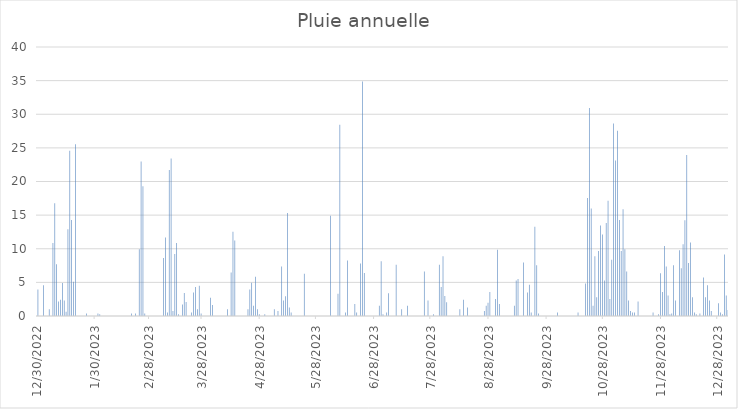
| Category | Pluie |
|---|---|
| 12/30/22 | 3.94 |
| 12/31/22 | 0 |
| 1/1/23 | 0 |
| 1/2/23 | 4.57 |
| 1/3/23 | 0 |
| 1/4/23 | 0 |
| 1/5/23 | 1.02 |
| 1/6/23 | 0 |
| 1/7/23 | 10.86 |
| 1/8/23 | 16.76 |
| 1/9/23 | 7.68 |
| 1/10/23 | 2.16 |
| 1/11/23 | 2.41 |
| 1/12/23 | 4.89 |
| 1/13/23 | 2.29 |
| 1/14/23 | 0.64 |
| 1/15/23 | 12.89 |
| 1/16/23 | 24.57 |
| 1/17/23 | 14.29 |
| 1/18/23 | 5.08 |
| 1/19/23 | 25.53 |
| 1/20/23 | 0 |
| 1/21/23 | 0 |
| 1/22/23 | 0 |
| 1/23/23 | 0 |
| 1/24/23 | 0 |
| 1/25/23 | 0.38 |
| 1/26/23 | 0 |
| 1/27/23 | 0 |
| 1/28/23 | 0 |
| 1/29/23 | 0 |
| 1/30/23 | 0 |
| 1/31/23 | 0.38 |
| 2/1/23 | 0.25 |
| 2/2/23 | 0 |
| 2/3/23 | 0 |
| 2/4/23 | 0 |
| 2/5/23 | 0 |
| 2/6/23 | 0 |
| 2/7/23 | 0 |
| 2/8/23 | 0 |
| 2/9/23 | 0 |
| 2/10/23 | 0 |
| 2/11/23 | 0 |
| 2/12/23 | 0 |
| 2/13/23 | 0 |
| 2/14/23 | 0 |
| 2/15/23 | 0 |
| 2/16/23 | 0 |
| 2/17/23 | 0 |
| 2/18/23 | 0.38 |
| 2/19/23 | 0 |
| 2/20/23 | 0.38 |
| 2/21/23 | 0 |
| 2/22/23 | 9.91 |
| 2/23/23 | 22.99 |
| 2/24/23 | 19.3 |
| 2/25/23 | 0.38 |
| 2/26/23 | 0 |
| 2/27/23 | 0 |
| 2/28/23 | 0 |
| 3/1/23 | 0 |
| 3/2/23 | 0 |
| 3/3/23 | 0 |
| 3/4/23 | 0 |
| 3/5/23 | 0 |
| 3/6/23 | 0 |
| 3/7/23 | 8.64 |
| 3/8/23 | 11.68 |
| 3/9/23 | 0.51 |
| 3/10/23 | 21.72 |
| 3/11/23 | 23.43 |
| 3/12/23 | 0.76 |
| 3/13/23 | 9.21 |
| 3/14/23 | 10.86 |
| 3/15/23 | 0.25 |
| 3/16/23 | 0 |
| 3/17/23 | 1.71 |
| 3/18/23 | 3.43 |
| 3/19/23 | 2.1 |
| 3/20/23 | 0 |
| 3/21/23 | 0 |
| 3/22/23 | 0.51 |
| 3/23/23 | 3.49 |
| 3/24/23 | 4.32 |
| 3/25/23 | 1.02 |
| 3/26/23 | 4.51 |
| 3/27/23 | 0.38 |
| 3/28/23 | 0 |
| 3/29/23 | 0 |
| 3/30/23 | 0 |
| 3/31/23 | 0 |
| 4/1/23 | 2.73 |
| 4/2/23 | 1.65 |
| 4/3/23 | 0 |
| 4/4/23 | 0 |
| 4/5/23 | 0 |
| 4/6/23 | 0 |
| 4/7/23 | 0 |
| 4/8/23 | 0 |
| 4/9/23 | 0 |
| 4/10/23 | 1.02 |
| 4/11/23 | 0 |
| 4/12/23 | 6.48 |
| 4/13/23 | 12.51 |
| 4/14/23 | 11.24 |
| 4/15/23 | 0 |
| 4/16/23 | 0 |
| 4/17/23 | 0 |
| 4/18/23 | 0 |
| 4/19/23 | 0 |
| 4/20/23 | 0 |
| 4/21/23 | 1.02 |
| 4/22/23 | 3.94 |
| 4/23/23 | 4.95 |
| 4/24/23 | 1.52 |
| 4/25/23 | 5.84 |
| 4/26/23 | 1.02 |
| 4/27/23 | 0.25 |
| 4/28/23 | 0 |
| 4/29/23 | 0 |
| 4/30/23 | 0.25 |
| 5/1/23 | 0 |
| 5/2/23 | 0 |
| 5/3/23 | 0 |
| 5/4/23 | 0 |
| 5/5/23 | 1.02 |
| 5/6/23 | 0 |
| 5/7/23 | 0.76 |
| 5/8/23 | 0 |
| 5/9/23 | 7.37 |
| 5/10/23 | 2.29 |
| 5/11/23 | 2.92 |
| 5/12/23 | 15.3 |
| 5/13/23 | 1.27 |
| 5/14/23 | 0.51 |
| 5/15/23 | 0 |
| 5/16/23 | 0 |
| 5/17/23 | 0 |
| 5/18/23 | 0 |
| 5/19/23 | 0 |
| 5/20/23 | 0 |
| 5/21/23 | 6.29 |
| 5/22/23 | 0 |
| 5/23/23 | 0 |
| 5/24/23 | 0 |
| 5/25/23 | 0 |
| 5/26/23 | 0 |
| 5/27/23 | 0 |
| 5/28/23 | 0 |
| 5/29/23 | 0 |
| 5/30/23 | 0 |
| 5/31/23 | 0 |
| 6/1/23 | 0 |
| 6/2/23 | 0 |
| 6/3/23 | 0 |
| 6/4/23 | 14.92 |
| 6/5/23 | 0 |
| 6/6/23 | 0 |
| 6/7/23 | 0 |
| 6/8/23 | 3.3 |
| 6/9/23 | 28.45 |
| 6/10/23 | 0 |
| 6/11/23 | 0 |
| 6/12/23 | 0.51 |
| 6/13/23 | 8.26 |
| 6/14/23 | 0 |
| 6/15/23 | 0 |
| 6/16/23 | 0 |
| 6/17/23 | 1.78 |
| 6/18/23 | 0.51 |
| 6/19/23 | 0 |
| 6/20/23 | 7.81 |
| 6/21/23 | 34.86 |
| 6/22/23 | 6.41 |
| 6/23/23 | 0 |
| 6/24/23 | 0 |
| 6/25/23 | 0 |
| 6/26/23 | 0 |
| 6/27/23 | 0 |
| 6/28/23 | 0 |
| 6/29/23 | 0 |
| 6/30/23 | 1.52 |
| 7/1/23 | 8.13 |
| 7/2/23 | 0.25 |
| 7/3/23 | 0 |
| 7/4/23 | 0.51 |
| 7/5/23 | 3.37 |
| 7/6/23 | 0 |
| 7/7/23 | 0 |
| 7/8/23 | 0 |
| 7/9/23 | 7.62 |
| 7/10/23 | 0 |
| 7/11/23 | 0 |
| 7/12/23 | 1.02 |
| 7/13/23 | 0 |
| 7/14/23 | 0 |
| 7/15/23 | 1.52 |
| 7/16/23 | 0 |
| 7/17/23 | 0 |
| 7/18/23 | 0 |
| 7/19/23 | 0 |
| 7/20/23 | 0 |
| 7/21/23 | 0 |
| 7/22/23 | 0 |
| 7/23/23 | 0 |
| 7/24/23 | 6.6 |
| 7/25/23 | 0 |
| 7/26/23 | 2.29 |
| 7/27/23 | 0 |
| 7/28/23 | 0 |
| 7/29/23 | 0.25 |
| 7/30/23 | 0 |
| 7/31/23 | 0 |
| 8/1/23 | 7.62 |
| 8/2/23 | 4.32 |
| 8/3/23 | 8.89 |
| 8/4/23 | 2.98 |
| 8/5/23 | 2.03 |
| 8/6/23 | 0 |
| 8/7/23 | 0 |
| 8/8/23 | 0 |
| 8/9/23 | 0 |
| 8/10/23 | 0 |
| 8/11/23 | 0 |
| 8/12/23 | 1.02 |
| 8/13/23 | 0 |
| 8/14/23 | 2.41 |
| 8/15/23 | 0 |
| 8/16/23 | 1.27 |
| 8/17/23 | 0 |
| 8/18/23 | 0 |
| 8/19/23 | 0 |
| 8/20/23 | 0 |
| 8/21/23 | 0 |
| 8/22/23 | 0 |
| 8/23/23 | 0 |
| 8/24/23 | 0 |
| 8/25/23 | 0.76 |
| 8/26/23 | 1.52 |
| 8/27/23 | 1.97 |
| 8/28/23 | 3.56 |
| 8/29/23 | 0 |
| 8/30/23 | 0 |
| 8/31/23 | 2.54 |
| 9/1/23 | 9.84 |
| 9/2/23 | 1.78 |
| 9/3/23 | 0 |
| 9/4/23 | 0 |
| 9/5/23 | 0 |
| 9/6/23 | 0 |
| 9/7/23 | 0 |
| 9/8/23 | 0 |
| 9/9/23 | 0 |
| 9/10/23 | 1.52 |
| 9/11/23 | 5.27 |
| 9/12/23 | 5.52 |
| 9/13/23 | 0 |
| 9/14/23 | 0 |
| 9/15/23 | 7.94 |
| 9/16/23 | 0 |
| 9/17/23 | 3.49 |
| 9/18/23 | 4.64 |
| 9/19/23 | 0.51 |
| 9/20/23 | 0 |
| 9/21/23 | 13.27 |
| 9/22/23 | 7.56 |
| 9/23/23 | 0.38 |
| 9/24/23 | 0 |
| 9/25/23 | 0 |
| 9/26/23 | 0 |
| 9/27/23 | 0 |
| 9/28/23 | 0 |
| 9/29/23 | 0 |
| 9/30/23 | 0 |
| 10/1/23 | 0 |
| 10/2/23 | 0 |
| 10/3/23 | 0.51 |
| 10/4/23 | 0 |
| 10/5/23 | 0 |
| 10/6/23 | 0 |
| 10/7/23 | 0 |
| 10/8/23 | 0 |
| 10/9/23 | 0 |
| 10/10/23 | 0 |
| 10/11/23 | 0 |
| 10/12/23 | 0 |
| 10/13/23 | 0 |
| 10/14/23 | 0.51 |
| 10/15/23 | 0 |
| 10/16/23 | 0 |
| 10/17/23 | 0 |
| 10/18/23 | 4.83 |
| 10/19/23 | 17.53 |
| 10/20/23 | 30.92 |
| 10/21/23 | 16 |
| 10/22/23 | 1.52 |
| 10/23/23 | 8.89 |
| 10/24/23 | 2.79 |
| 10/25/23 | 9.65 |
| 10/26/23 | 13.46 |
| 10/27/23 | 12.13 |
| 10/28/23 | 5.27 |
| 10/29/23 | 13.84 |
| 10/30/23 | 17.15 |
| 10/31/23 | 2.54 |
| 11/1/23 | 8.38 |
| 11/2/23 | 28.64 |
| 11/3/23 | 23.11 |
| 11/4/23 | 27.56 |
| 11/5/23 | 14.29 |
| 11/6/23 | 9.65 |
| 11/7/23 | 15.88 |
| 11/8/23 | 9.91 |
| 11/9/23 | 6.6 |
| 11/10/23 | 2.29 |
| 11/11/23 | 0.76 |
| 11/12/23 | 0.51 |
| 11/13/23 | 0.51 |
| 11/14/23 | 0 |
| 11/15/23 | 2.16 |
| 11/16/23 | 0 |
| 11/17/23 | 0 |
| 11/18/23 | 0 |
| 11/19/23 | 0 |
| 11/20/23 | 0 |
| 11/21/23 | 0 |
| 11/22/23 | 0 |
| 11/23/23 | 0.51 |
| 11/24/23 | 0 |
| 11/25/23 | 0 |
| 11/26/23 | 0.25 |
| 11/27/23 | 6.35 |
| 11/28/23 | 3.56 |
| 11/29/23 | 10.41 |
| 11/30/23 | 7.37 |
| 12/1/23 | 3.05 |
| 12/2/23 | 0.25 |
| 12/3/23 | 0.38 |
| 12/4/23 | 7.56 |
| 12/5/23 | 2.29 |
| 12/6/23 | 0 |
| 12/7/23 | 9.78 |
| 12/8/23 | 7.11 |
| 12/9/23 | 10.67 |
| 12/10/23 | 14.22 |
| 12/11/23 | 23.94 |
| 12/12/23 | 7.87 |
| 12/13/23 | 10.92 |
| 12/14/23 | 2.79 |
| 12/15/23 | 0.51 |
| 12/16/23 | 0.25 |
| 12/17/23 | 0 |
| 12/18/23 | 0.38 |
| 12/19/23 | 0 |
| 12/20/23 | 5.72 |
| 12/21/23 | 2.79 |
| 12/22/23 | 4.57 |
| 12/23/23 | 2.29 |
| 12/24/23 | 0.76 |
| 12/25/23 | 0 |
| 12/26/23 | 0 |
| 12/27/23 | 0 |
| 12/28/23 | 1.91 |
| 12/29/23 | 0.51 |
| 12/30/23 | 0.25 |
| 12/31/23 | 9.14 |
| 1/1/24 | 3.05 |
| 1/2/24 | 0.89 |